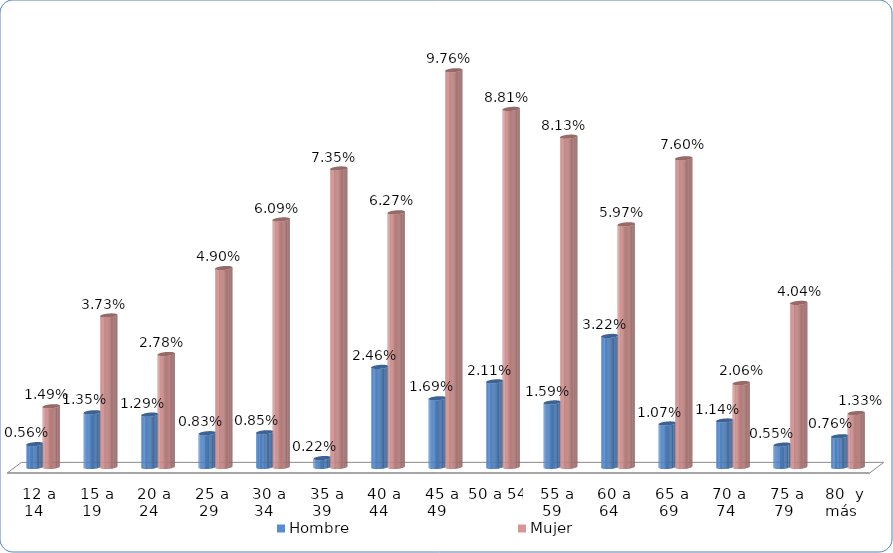
| Category | Hombre | Mujer |
|---|---|---|
|  12 a 14  | 0.006 | 0.015 |
|  15 a 19  | 0.013 | 0.037 |
|  20 a 24  | 0.013 | 0.028 |
|  25 a 29 | 0.008 | 0.049 |
|  30 a 34  | 0.009 | 0.061 |
|  35 a 39  | 0.002 | 0.073 |
|  40 a 44  | 0.025 | 0.063 |
|  45 a 49  | 0.017 | 0.098 |
| 50 a 54  | 0.021 | 0.088 |
|  55 a 59  | 0.016 | 0.081 |
|  60 a 64  | 0.032 | 0.06 |
|  65 a 69 | 0.011 | 0.076 |
|  70 a 74 | 0.011 | 0.021 |
|  75 a 79 | 0.006 | 0.04 |
|  80  y más | 0.008 | 0.013 |